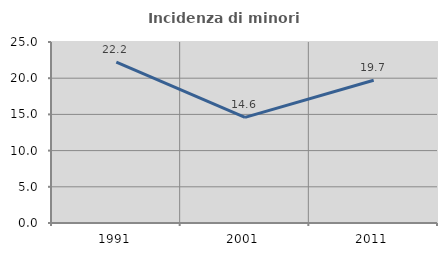
| Category | Incidenza di minori stranieri |
|---|---|
| 1991.0 | 22.222 |
| 2001.0 | 14.583 |
| 2011.0 | 19.718 |